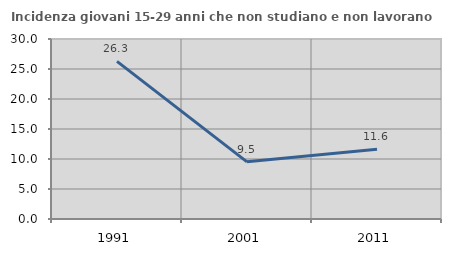
| Category | Incidenza giovani 15-29 anni che non studiano e non lavorano  |
|---|---|
| 1991.0 | 26.277 |
| 2001.0 | 9.524 |
| 2011.0 | 11.618 |